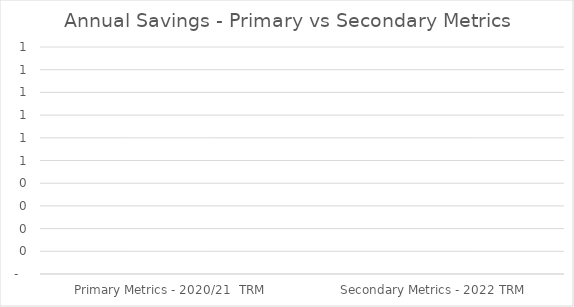
| Category | Series 0 |
|---|---|
| Primary Metrics - 2020/21  TRM | 0 |
| Secondary Metrics - 2022 TRM | 0 |